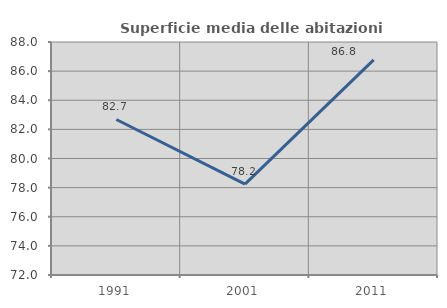
| Category | Superficie media delle abitazioni occupate |
|---|---|
| 1991.0 | 82.678 |
| 2001.0 | 78.245 |
| 2011.0 | 86.774 |